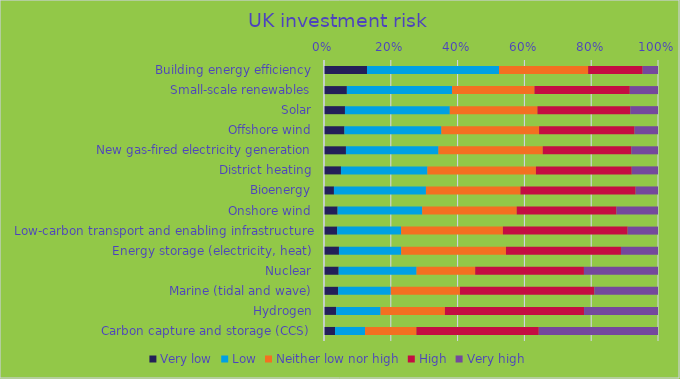
| Category | Very low | Low | Neither low nor high | High | Very high |
|---|---|---|---|---|---|
|  Building energy efficiency | 0.129 | 0.395 | 0.267 | 0.163 | 0.046 |
|  Small-scale renewables | 0.068 | 0.315 | 0.247 | 0.285 | 0.084 |
|  Solar | 0.063 | 0.314 | 0.262 | 0.278 | 0.083 |
|  Offshore wind | 0.061 | 0.29 | 0.293 | 0.286 | 0.07 |
|  New gas-fired electricity generation | 0.066 | 0.277 | 0.312 | 0.265 | 0.08 |
|  District heating | 0.051 | 0.259 | 0.325 | 0.287 | 0.079 |
|  Bioenergy | 0.03 | 0.275 | 0.283 | 0.345 | 0.067 |
|  Onshore wind | 0.041 | 0.253 | 0.283 | 0.299 | 0.124 |
|  Low-carbon transport and enabling infrastructure | 0.039 | 0.192 | 0.305 | 0.373 | 0.091 |
|  Energy storage (electricity, heat) | 0.045 | 0.186 | 0.314 | 0.344 | 0.111 |
|  Nuclear | 0.044 | 0.233 | 0.176 | 0.326 | 0.222 |
|  Marine (tidal and wave) | 0.042 | 0.158 | 0.207 | 0.402 | 0.191 |
|  Hydrogen | 0.036 | 0.133 | 0.193 | 0.417 | 0.221 |
|  Carbon capture and storage (CCS)  | 0.033 | 0.09 | 0.154 | 0.366 | 0.357 |